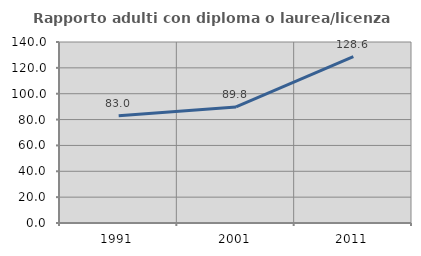
| Category | Rapporto adulti con diploma o laurea/licenza media  |
|---|---|
| 1991.0 | 82.989 |
| 2001.0 | 89.756 |
| 2011.0 | 128.619 |